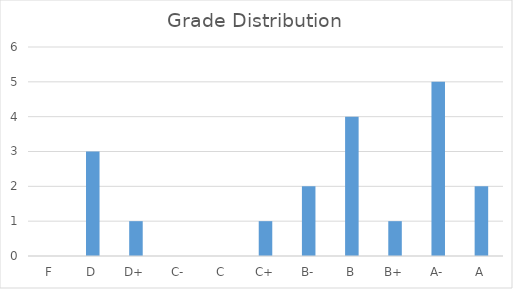
| Category | Series 0 |
|---|---|
| F | 0 |
| D | 3 |
| D+ | 1 |
| C- | 0 |
| C | 0 |
| C+ | 1 |
| B- | 2 |
| B | 4 |
| B+ | 1 |
| A- | 5 |
| A | 2 |